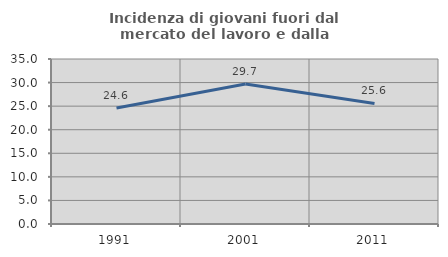
| Category | Incidenza di giovani fuori dal mercato del lavoro e dalla formazione  |
|---|---|
| 1991.0 | 24.625 |
| 2001.0 | 29.692 |
| 2011.0 | 25.578 |